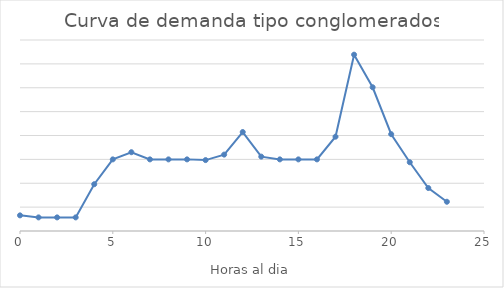
| Category | Potencia kW |
|---|---|
| 0.0 | 0.131 |
| 1.0 | 0.114 |
| 2.0 | 0.114 |
| 3.0 | 0.114 |
| 4.0 | 0.392 |
| 5.0 | 0.6 |
| 6.0 | 0.66 |
| 7.0 | 0.6 |
| 8.0 | 0.6 |
| 9.0 | 0.6 |
| 10.0 | 0.594 |
| 11.0 | 0.64 |
| 12.0 | 0.829 |
| 13.0 | 0.623 |
| 14.0 | 0.6 |
| 15.0 | 0.6 |
| 16.0 | 0.6 |
| 17.0 | 0.79 |
| 18.0 | 1.477 |
| 19.0 | 1.204 |
| 20.0 | 0.811 |
| 21.0 | 0.576 |
| 22.0 | 0.36 |
| 23.0 | 0.245 |